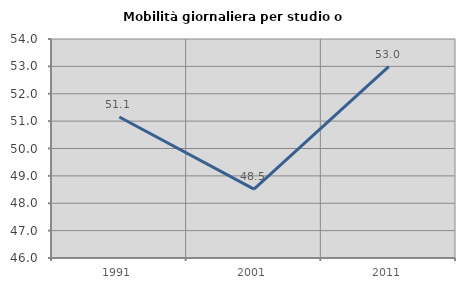
| Category | Mobilità giornaliera per studio o lavoro |
|---|---|
| 1991.0 | 51.149 |
| 2001.0 | 48.516 |
| 2011.0 | 52.994 |